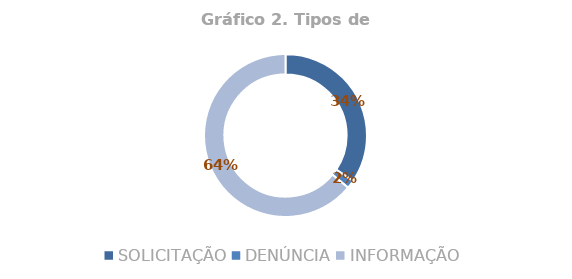
| Category | Total |
|---|---|
| SOLICITAÇÃO | 0.344 |
| DENÚNCIA | 0.016 |
| INFORMAÇÃO | 0.639 |